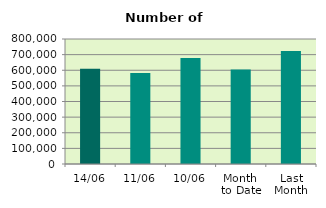
| Category | Series 0 |
|---|---|
| 14/06 | 610322 |
| 11/06 | 582932 |
| 10/06 | 678430 |
| Month 
to Date | 604435 |
| Last
Month | 723791.905 |